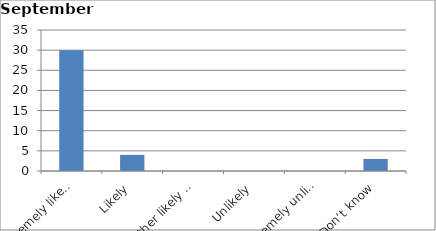
| Category | Series 0 |
|---|---|
| Extremely likely | 30 |
| Likely | 4 |
| Neither likely nor unlikely | 0 |
| Unlikely | 0 |
| Extremely unlikely | 0 |
| Don’t know | 3 |